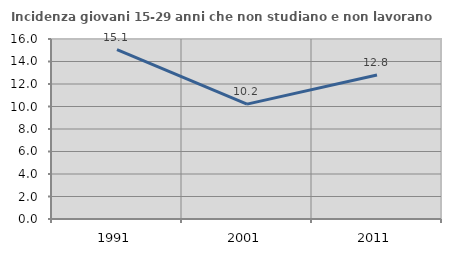
| Category | Incidenza giovani 15-29 anni che non studiano e non lavorano  |
|---|---|
| 1991.0 | 15.062 |
| 2001.0 | 10.209 |
| 2011.0 | 12.794 |